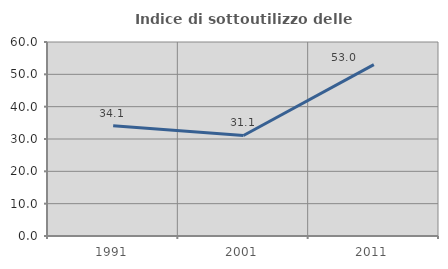
| Category | Indice di sottoutilizzo delle abitazioni  |
|---|---|
| 1991.0 | 34.084 |
| 2001.0 | 31.09 |
| 2011.0 | 53 |